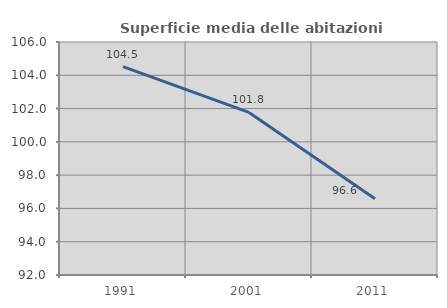
| Category | Superficie media delle abitazioni occupate |
|---|---|
| 1991.0 | 104.52 |
| 2001.0 | 101.769 |
| 2011.0 | 96.584 |